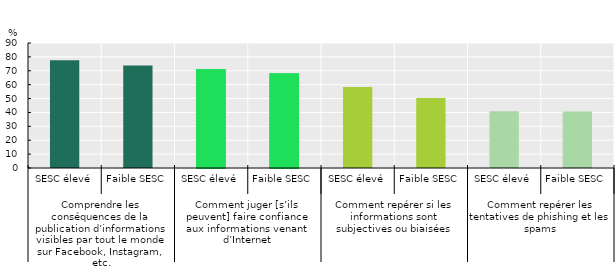
| Category | Series 0 |
|---|---|
| 0 | 77.5 |
| 1 | 73.793 |
| 2 | 70.941 |
| 3 | 67.913 |
| 4 | 58.284 |
| 5 | 50.393 |
| 6 | 40.854 |
| 7 | 40.669 |